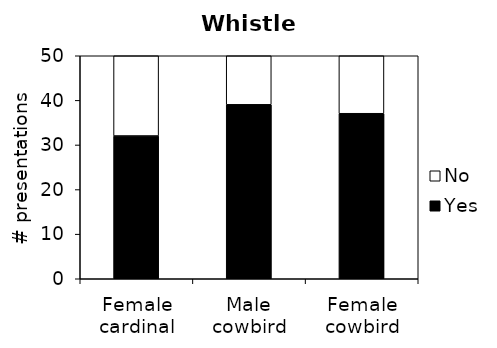
| Category | Yes | No |
|---|---|---|
| Female cardinal | 32 | 18 |
| Male cowbird | 39 | 11 |
| Female cowbird | 37 | 13 |